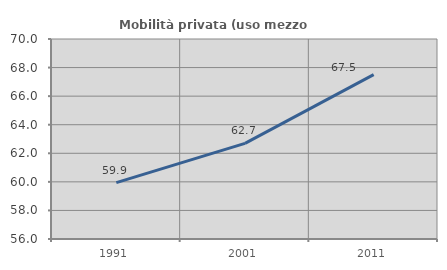
| Category | Mobilità privata (uso mezzo privato) |
|---|---|
| 1991.0 | 59.949 |
| 2001.0 | 62.697 |
| 2011.0 | 67.511 |